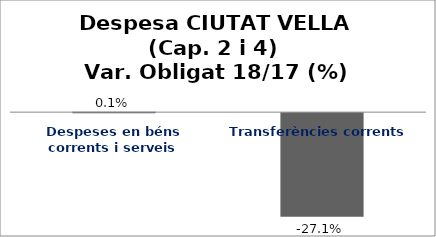
| Category | Series 0 |
|---|---|
| Despeses en béns corrents i serveis | 0.001 |
| Transferències corrents | -0.271 |